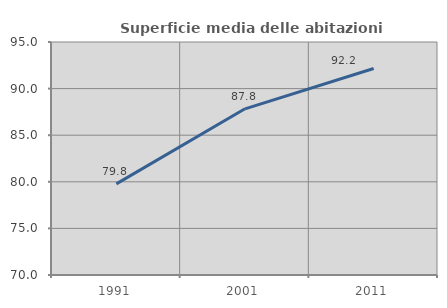
| Category | Superficie media delle abitazioni occupate |
|---|---|
| 1991.0 | 79.777 |
| 2001.0 | 87.831 |
| 2011.0 | 92.161 |